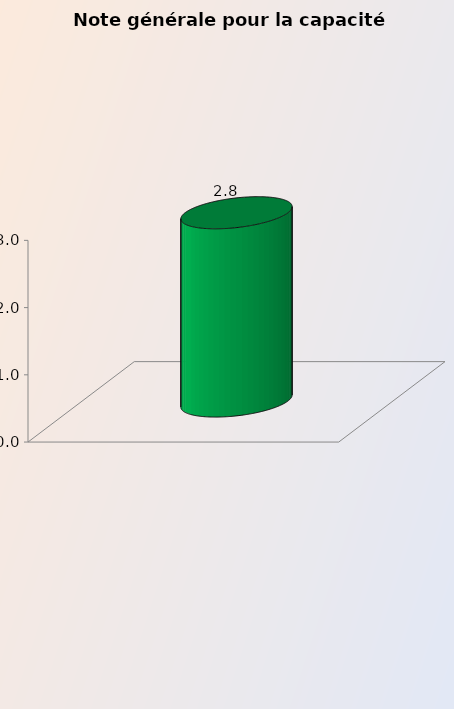
| Category | Note générale pour la capacité organisationnelle |
|---|---|
| Note générale pour la catégorie | 2.8 |